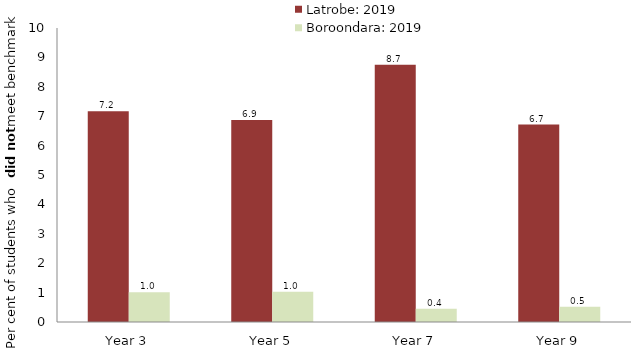
| Category | Latrobe: 2019 | Boroondara: 2019 |
|---|---|---|
| Year 3 | 7.166 | 1.016 |
| Year 5 | 6.87 | 1.025 |
| Year 7 | 8.747 | 0.448 |
| Year 9 | 6.718 | 0.517 |